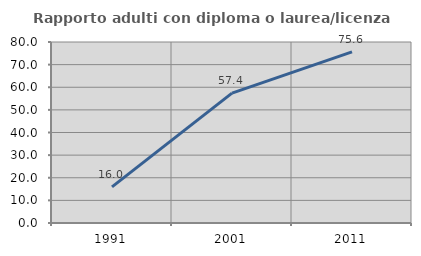
| Category | Rapporto adulti con diploma o laurea/licenza media  |
|---|---|
| 1991.0 | 15.962 |
| 2001.0 | 57.414 |
| 2011.0 | 75.641 |